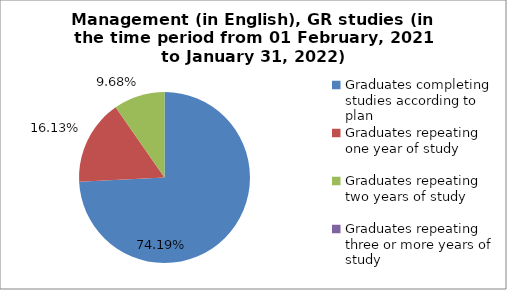
| Category | Series 0 |
|---|---|
| Graduates completing studies according to plan | 74.194 |
| Graduates repeating one year of study | 16.129 |
| Graduates repeating two years of study | 9.677 |
| Graduates repeating three or more years of study | 0 |